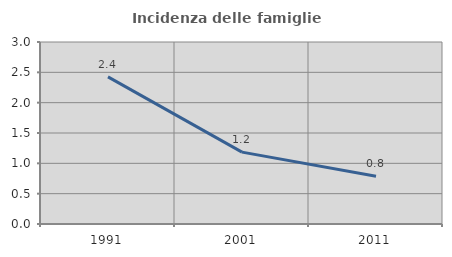
| Category | Incidenza delle famiglie numerose |
|---|---|
| 1991.0 | 2.424 |
| 2001.0 | 1.184 |
| 2011.0 | 0.788 |